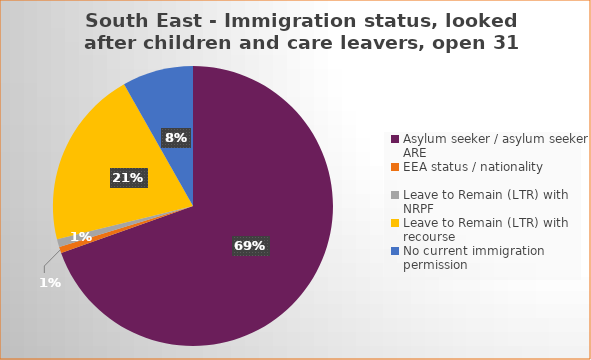
| Category | Number  | Percentage |
|---|---|---|
| Asylum seeker / asylum seeker ARE | 297 | 0.69 |
| EEA status / nationality  | 3 | 0.007 |
| Leave to Remain (LTR) with NRPF | 4 | 0.009 |
| Leave to Remain (LTR) with recourse | 88 | 0.206 |
| No current immigration permission | 35 | 0.082 |